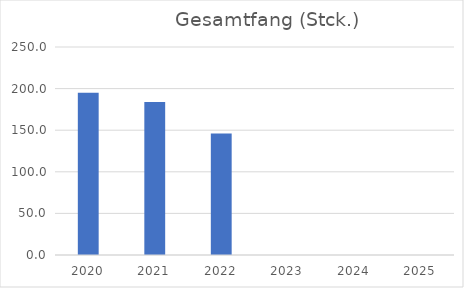
| Category | Gesamtfang (Stck.) |
|---|---|
| 2020.0 | 195 |
| 2021.0 | 184 |
| 2022.0 | 146 |
| 2023.0 | 0 |
| 2024.0 | 0 |
| 2025.0 | 0 |